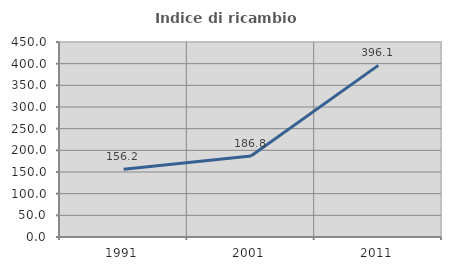
| Category | Indice di ricambio occupazionale  |
|---|---|
| 1991.0 | 156.154 |
| 2001.0 | 186.777 |
| 2011.0 | 396.089 |